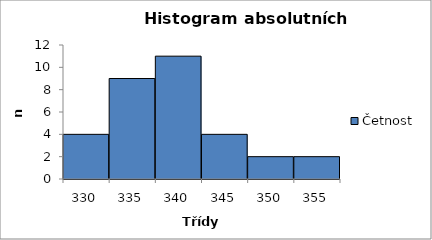
| Category | Četnost |
|---|---|
| 330.0 | 4 |
| 335.0 | 9 |
| 340.0 | 11 |
| 345.0 | 4 |
| 350.0 | 2 |
| 355.0 | 2 |